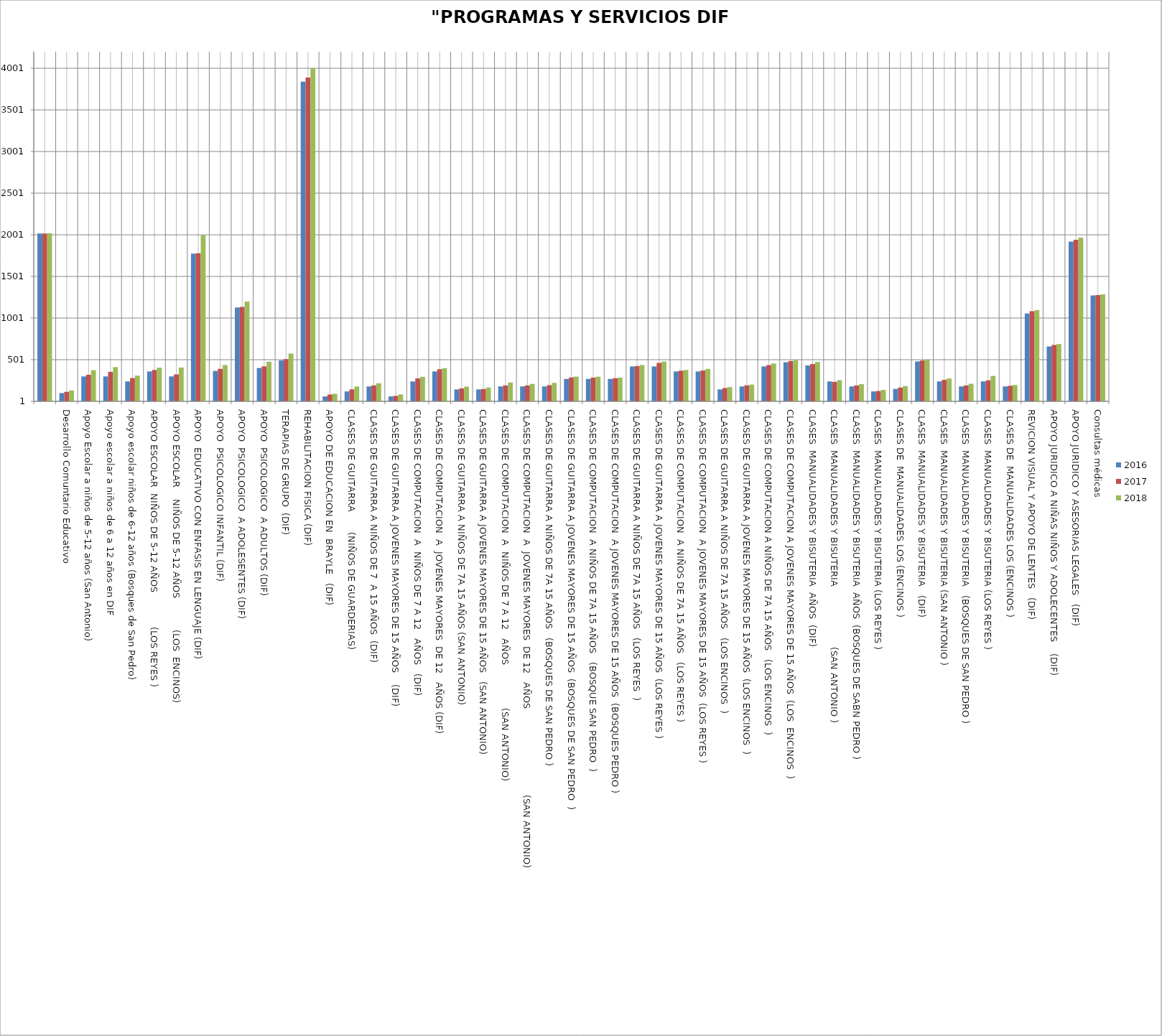
| Category | 2016 | 2017 | 2018 |
|---|---|---|---|
|   | 2016 | 2017 | 2018 |
| Desarrollo Comuntario Educativo | 100 | 115 | 132 |
| Apoyo Escolar a niños de 5-12 años (San Antonio) | 300 | 320 | 375 |
| Apoyo escolar a niños de 6 a 12 años en DIF | 300 | 355 | 412 |
| Apoyo escolar niños de 6-12 años (Bosques de San Pedro) | 240 | 280 | 310 |
| APOYO ESCOLAR  NIÑOS DE 5-12 AÑOS            (LOS REYES ) | 360 | 377 | 405 |
| APOYO ESCOLAR    NIÑOS DE 5-12 AÑOS           (LOS  ENCINOS)  | 300 | 325 | 407 |
| APOYO  EDUCATIVO CON ENFASIS EN LENGUAJE (DIF) | 1776 | 1780 | 1996 |
| APOYO  PSICOLOGICO INFANTIL (DIF) | 366 | 391 | 437 |
| APOYO  PSICOLOGICO  A ADOLESENTES (DIF) | 1128 | 1135 | 1199 |
| APOYO  PSICOLOGICO  A ADULTOS (DIF) | 402 | 421 | 477 |
| TERAPIAS DE GRUPO  (DIF)   | 492 | 508 | 575 |
| REHABILITACION FISICA (DIF)  | 3840 | 3889 | 4001 |
| APOYO DE EDUCACION EN  BRAYLE   (DIF) | 60 | 83 | 92 |
| CLASES DE GUITARRA       (NIÑOS DE GUARDERIAS)    | 120 | 145 | 179 |
| CLASES DE GUITARRA A NIÑOS DE 7  A 15 AÑOS  (DIF) | 180 | 193 | 218 |
| CLASES DE GUITARRA A JOVENES MAYORES DE 15 AÑOS    (DIF) | 60 | 67 | 84 |
| CLASES DE COMPUTACION  A  NIÑOS DE 7 A 12   AÑOS   (DIF) | 240 | 276 | 295 |
| CLASES DE COMPUTACION  A  JOVENES MAYORES  DE 12   AÑOS (DIF)   | 360 | 387 | 399 |
| CLASES DE GUITARRA A NIÑOS DE 7A 15 AÑOS (SAN ANTONIO)   | 144 | 156 | 177 |
| CLASES DE GUITARRA A JOVENES MAYORES DE 15 AÑOS   (SAN ANTONIO)   | 144 | 149 | 167 |
| CLASES DE COMPUTACION  A  NIÑOS DE 7 A 12   AÑOS               (SAN ANTONIO)   | 180 | 192 | 227 |
| CLASES DE COMPUTACION  A  JOVENES MAYORES  DE 12   AÑOS                              (SAN ANTONIO)    | 180 | 192 | 210 |
| CLASES DE GUITARRA A NIÑOS DE 7A 15 AÑOS   (BOSQUES DE SAN PEDRO )    | 180 | 195 | 223 |
| CLASES DE GUITARRA A JOVENES MAYORES DE 15 AÑOS  (BOSQUES DE SAN PEDRO  )  | 270 | 288 | 298 |
| CLASES DE COMPUTACION  A NIÑOS DE 7A 15 AÑOS   (BOSQUE SAN PEDRO  )    | 270 | 286 | 297 |
| CLASES DE COMPUTACION  A JOVENES MAYORES DE 15 AÑOS  (BOSQUES PEDRO )  | 270 | 279 | 286 |
| CLASES DE GUITARRA A NIÑOS DE 7A 15 AÑOS   (LOS REYES  )    | 420 | 425 | 437 |
| CLASES DE GUITARRA A JOVENES MAYORES DE 15 AÑOS  (LOS REYES )  | 420 | 462 | 479 |
| CLASES DE COMPUTACION  A NIÑOS DE 7A 15 AÑOS   (LOS REYES )    | 360 | 369 | 378 |
| CLASES DE COMPUTACION  A JOVENES MAYORES DE 15 AÑOS  (LOS REYES )  | 360 | 372 | 391 |
| CLASES DE GUITARRA A NIÑOS DE 7A 15 AÑOS   (LOS ENCINOS  )    | 144 | 161 | 172 |
| CLASES DE GUITARRA A JOVENES MAYORES DE 15 AÑOS  (LOS ENCINOS  )  | 180 | 193 | 202 |
| CLASES DE COMPUTACION A NIÑOS DE 7A 15 AÑOS   (LOS ENCINOS  )    | 420 | 436 | 455 |
| CLASES DE COMPUTACION A JOVENES MAYORES DE 15 AÑOS  (LOS  ENCINOS  )  | 470 | 485 | 496 |
| CLASES  MANUALIDADES Y BISUTERIA  AÑOS  (DIF) | 432 | 449 | 474 |
| CLASES  MANUALIDADES Y BISUTERIA                     (SAN ANTONIO ) | 240 | 235 | 255 |
| CLASES  MANUALIDADES Y BISUTERIA  AÑOS  (BOSQUES DE SABN PEDRO ) | 180 | 192 | 208 |
| CLASES  MANUALIDADES Y BISUTERIA (LOS REYES ) | 120 | 125 | 138 |
| CLASES DE  MANUALIDADES LOS (ENCINOS ) | 150 | 166 | 184 |
| CLASES  MANUALIDADES Y BISUTERIA   (DIF) | 480 | 491 | 503 |
| CLASES  MANUALIDADES Y BISUTERIA (SAN ANTONIO ) | 240 | 259 | 276 |
| CLASES  MANUALIDADES Y BISUTERIA   (BOSQUES DE SAN PEDRO ) | 180 | 192 | 212 |
| CLASES  MANUALIDADES Y BISUTERIA (LOS REYES ) | 240 | 253 | 306 |
| CLASES DE  MANUALIDADES LOS (ENCINOS ) | 180 | 188 | 197 |
| REVICION VISUAL Y APOYO DE LENTES   (DIF) | 1056 | 1084 | 1096 |
| APOYO JURIDICO A NIÑAS NIÑOS Y ADOLECENTES    (DIF) | 660 | 678 | 689 |
| APOYO JURIDICO Y ASESORIAS LEGALES   (DIF) | 1920 | 1941 | 1967 |
| Consultas médicas | 1272 | 1278 | 1286 |